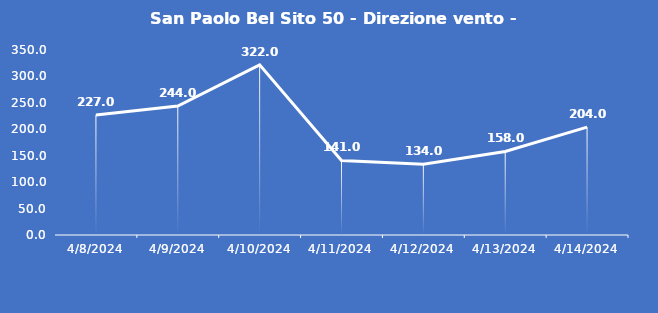
| Category | San Paolo Bel Sito 50 - Direzione vento - Grezzo (°N) |
|---|---|
| 4/8/24 | 227 |
| 4/9/24 | 244 |
| 4/10/24 | 322 |
| 4/11/24 | 141 |
| 4/12/24 | 134 |
| 4/13/24 | 158 |
| 4/14/24 | 204 |